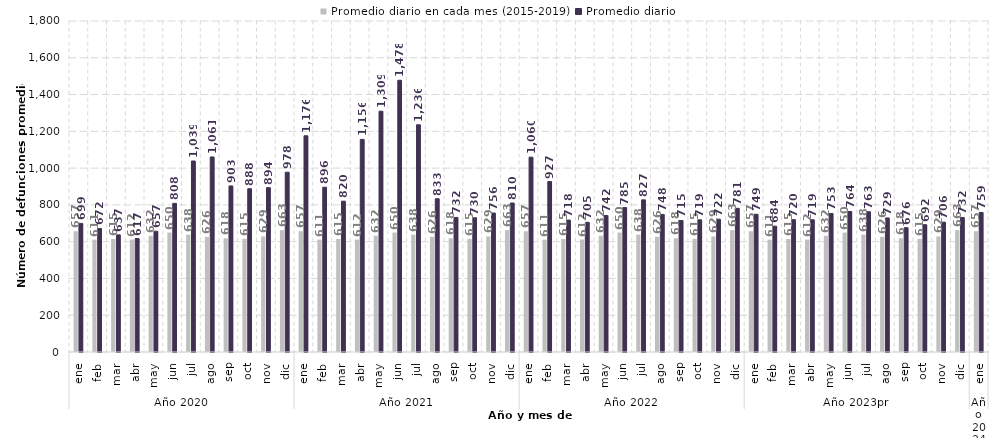
| Category | Promedio diario en cada mes (2015-2019) | Promedio diario |
|---|---|---|
| 0 | 656.794 | 699.387 |
| 1 | 611.097 | 671.862 |
| 2 | 614.516 | 637 |
| 3 | 611.54 | 617 |
| 4 | 632.077 | 656.774 |
| 5 | 649.54 | 808.2 |
| 6 | 638.271 | 1038.645 |
| 7 | 626.452 | 1060.677 |
| 8 | 618.193 | 903.133 |
| 9 | 615.303 | 888 |
| 10 | 628.567 | 893.733 |
| 11 | 662.645 | 977.806 |
| 12 | 656.794 | 1175.871 |
| 13 | 611.097 | 896.143 |
| 14 | 614.516 | 820.323 |
| 15 | 611.54 | 1156.267 |
| 16 | 632.077 | 1309.419 |
| 17 | 649.54 | 1477.567 |
| 18 | 638.271 | 1235.516 |
| 19 | 626.452 | 833.419 |
| 20 | 618.193 | 731.8 |
| 21 | 615.303 | 729.871 |
| 22 | 628.567 | 755.733 |
| 23 | 662.645 | 810.29 |
| 24 | 656.794 | 1059.742 |
| 25 | 611.097 | 926.714 |
| 26 | 614.516 | 717.581 |
| 27 | 611.54 | 705.267 |
| 28 | 632.077 | 742.452 |
| 29 | 649.54 | 785.433 |
| 30 | 638.271 | 827.387 |
| 31 | 626.452 | 748.226 |
| 32 | 618.193 | 715.233 |
| 33 | 615.303 | 718.613 |
| 34 | 628.567 | 722.367 |
| 35 | 662.645 | 781.29 |
| 36 | 656.794 | 749 |
| 37 | 611.097 | 684.31 |
| 38 | 614.516 | 719.71 |
| 39 | 611.54 | 719.067 |
| 40 | 632.077 | 753.419 |
| 41 | 649.54 | 764.2 |
| 42 | 638.271 | 762.677 |
| 43 | 626.452 | 728.968 |
| 44 | 618.193 | 676.067 |
| 45 | 615.303 | 692.375 |
| 46 | 628.567 | 706.033 |
| 47 | 662.645 | 731.645 |
| 48 | 656.794 | 758.968 |